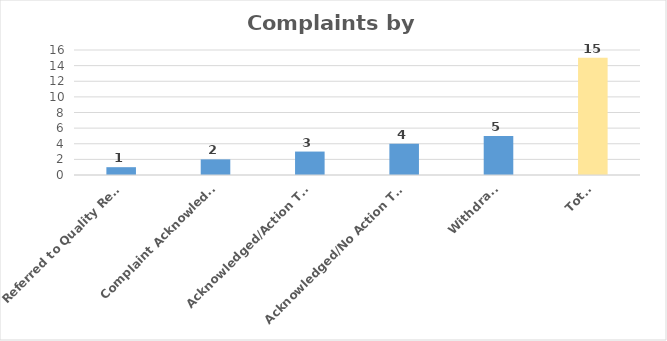
| Category | Count |
|---|---|
| Referred to Quality Review | 1 |
| Complaint Acknowledged | 2 |
| Acknowledged/Action Taken | 3 |
| Acknowledged/No Action Taken | 4 |
| Withdrawn | 5 |
| Total | 15 |